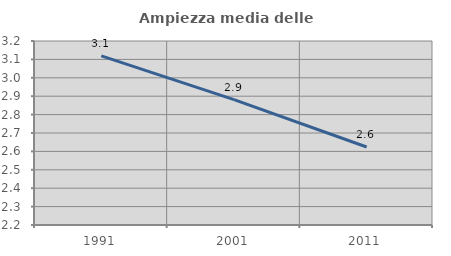
| Category | Ampiezza media delle famiglie |
|---|---|
| 1991.0 | 3.12 |
| 2001.0 | 2.881 |
| 2011.0 | 2.624 |